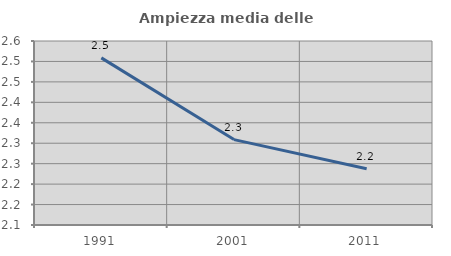
| Category | Ampiezza media delle famiglie |
|---|---|
| 1991.0 | 2.509 |
| 2001.0 | 2.309 |
| 2011.0 | 2.238 |